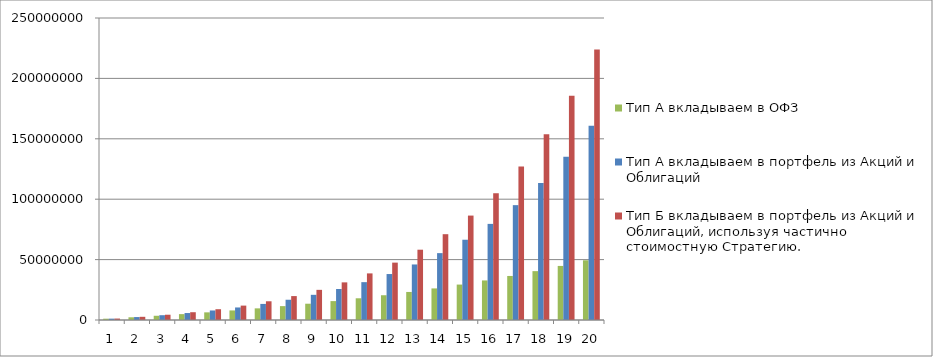
| Category | Тип А вкладываем в ОФЗ | Тип А вкладываем в портфель из Акций и Облигаций | Тип Б вкладываем в портфель из Акций и Облигаций, используя частично стоимостную Стратегию. |
|---|---|---|---|
| 0 | 1080000 | 1121800 | 1200000 |
| 1 | 2246400 | 2433273.92 | 2640000 |
| 2 | 3506112 | 3969397.631 | 4368000 |
| 3 | 4866600.96 | 5771596.554 | 6441600 |
| 4 | 6335929.037 | 7888934.959 | 8929920 |
| 5 | 7922803.36 | 10379524.565 | 11915904 |
| 6 | 9636627.629 | 13312192.895 | 15499084.8 |
| 7 | 11487557.839 | 16768459.264 | 19798901.76 |
| 8 | 13486562.466 | 20844875.153 | 24958682.112 |
| 9 | 15645487.463 | 25655796.131 | 31150418.534 |
| 10 | 17977126.46 | 31336664.937 | 38580502.241 |
| 11 | 20495296.577 | 38047899.952 | 47496602.69 |
| 12 | 23214920.303 | 45979500.703 | 58195923.227 |
| 13 | 26152113.927 | 55356502.633 | 71035107.873 |
| 14 | 29324283.042 | 66445437.718 | 86442129.448 |
| 15 | 32750225.685 | 79561986.434 | 104930555.337 |
| 16 | 36450243.74 | 95080040.732 | 127116666.404 |
| 17 | 40446263.239 | 113442438.243 | 153739999.685 |
| 18 | 44761964.298 | 135173675.855 | 185687999.622 |
| 19 | 49422921.442 | 160894967.682 | 224025599.547 |